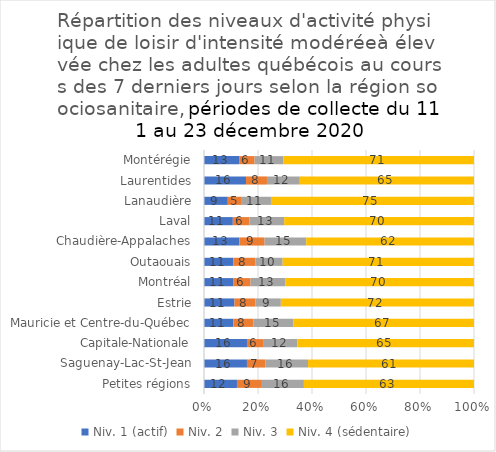
| Category | Niv. 1 (actif) | Niv. 2 | Niv. 3 | Niv. 4 (sédentaire) |
|---|---|---|---|---|
| Petites régions | 12.207 | 9.232 | 15.565 | 62.996 |
| Saguenay-Lac-St-Jean | 15.91 | 6.891 | 15.726 | 61.473 |
| Capitale-Nationale | 15.917 | 6.234 | 12.38 | 65.468 |
| Mauricie et Centre-du-Québec | 10.826 | 7.525 | 14.793 | 66.856 |
| Estrie | 11.29 | 7.798 | 9.376 | 71.537 |
| Montréal | 10.972 | 6.289 | 12.942 | 69.797 |
| Outaouais | 10.894 | 8.202 | 10.03 | 70.874 |
| Chaudière-Appalaches | 13.072 | 9.374 | 15.419 | 62.135 |
| Laval | 10.675 | 6.171 | 12.862 | 70.292 |
| Lanaudière | 8.815 | 5.194 | 10.793 | 75.199 |
| Laurentides | 15.571 | 7.747 | 12.166 | 64.515 |
| Montérégie | 12.99 | 5.751 | 10.717 | 70.542 |